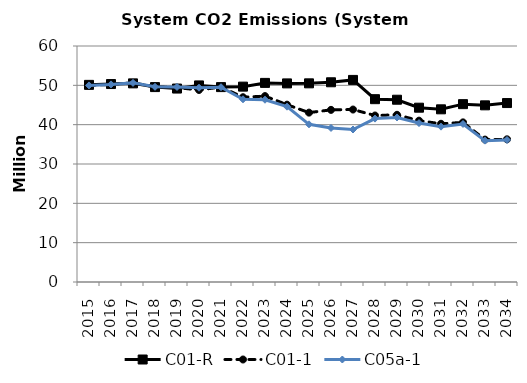
| Category | C01-R | C01-1 | C05a-1 |
|---|---|---|---|
| 2015.0 | 50.118 | 49.98 | 49.98 |
| 2016.0 | 50.329 | 50.239 | 50.239 |
| 2017.0 | 50.499 | 50.623 | 50.623 |
| 2018.0 | 49.555 | 49.637 | 49.62 |
| 2019.0 | 49.181 | 49.422 | 49.588 |
| 2020.0 | 49.976 | 48.827 | 49.391 |
| 2021.0 | 49.548 | 49.578 | 49.52 |
| 2022.0 | 49.671 | 46.971 | 46.454 |
| 2023.0 | 50.618 | 47.262 | 46.336 |
| 2024.0 | 50.491 | 45.086 | 44.578 |
| 2025.0 | 50.508 | 43.063 | 40.083 |
| 2026.0 | 50.777 | 43.764 | 39.163 |
| 2027.0 | 51.38 | 43.847 | 38.769 |
| 2028.0 | 46.481 | 42.329 | 41.541 |
| 2029.0 | 46.342 | 42.511 | 41.829 |
| 2030.0 | 44.317 | 41.021 | 40.405 |
| 2031.0 | 43.901 | 40.228 | 39.498 |
| 2032.0 | 45.215 | 40.585 | 40.178 |
| 2033.0 | 44.915 | 36.207 | 35.941 |
| 2034.0 | 45.496 | 36.272 | 36.103 |